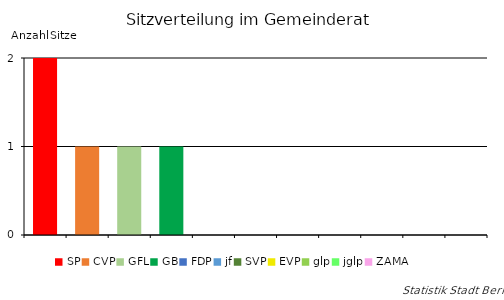
| Category | Series 0 |
|---|---|
| SP | 2 |
| CVP | 1 |
| GFL | 1 |
| GB | 1 |
| FDP | 0 |
| jf | 0 |
| SVP | 0 |
| EVP | 0 |
| glp | 0 |
| jglp | 0 |
| ZÄMÄ | 0 |